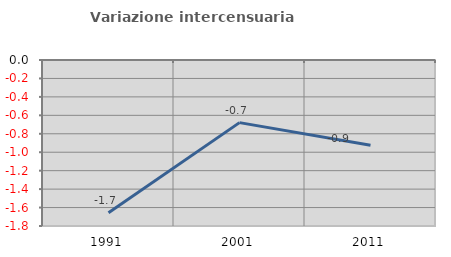
| Category | Variazione intercensuaria annua |
|---|---|
| 1991.0 | -1.655 |
| 2001.0 | -0.679 |
| 2011.0 | -0.924 |